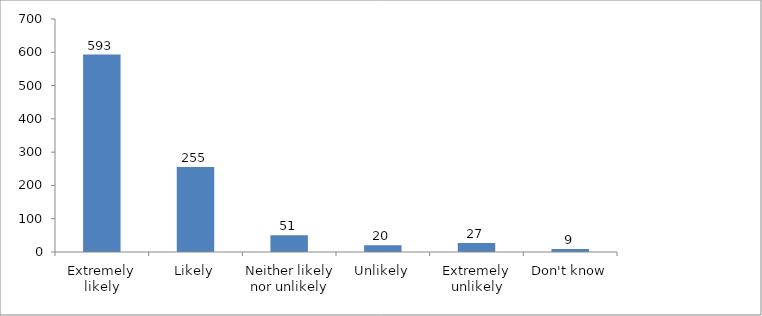
| Category | Series 0 |
|---|---|
| Extremely likely | 593 |
| Likely | 255 |
| Neither likely nor unlikely | 50 |
| Unlikely | 20 |
| Extremely unlikely | 27 |
| Don't know | 9 |